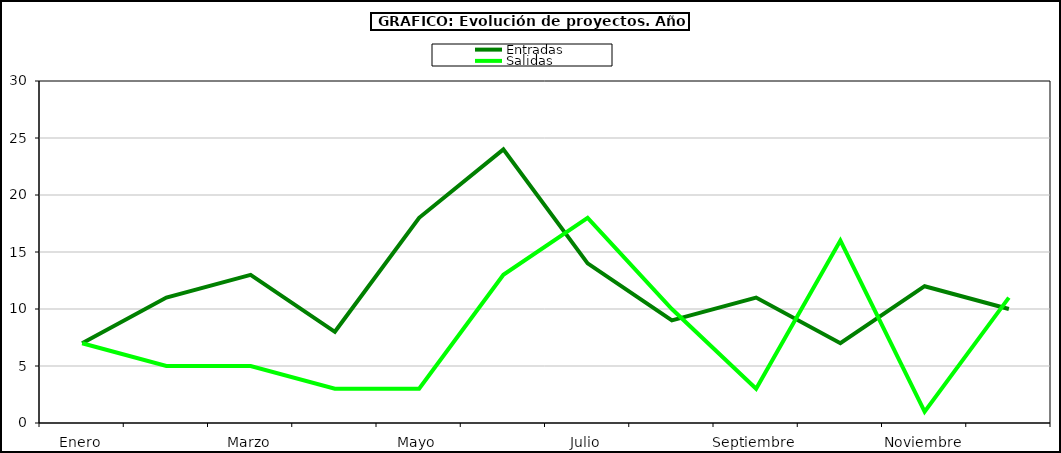
| Category | Entradas | Salidas |
|---|---|---|
| Enero | 7 | 7 |
| Febrero | 11 | 5 |
| Marzo | 13 | 5 |
| Abril | 8 | 3 |
| Mayo | 18 | 3 |
| Junio | 24 | 13 |
| Julio | 14 | 18 |
| Agosto | 9 | 10 |
| Septiembre | 11 | 3 |
| Octubre | 7 | 16 |
| Noviembre | 12 | 1 |
| Diciembre | 10 | 11 |